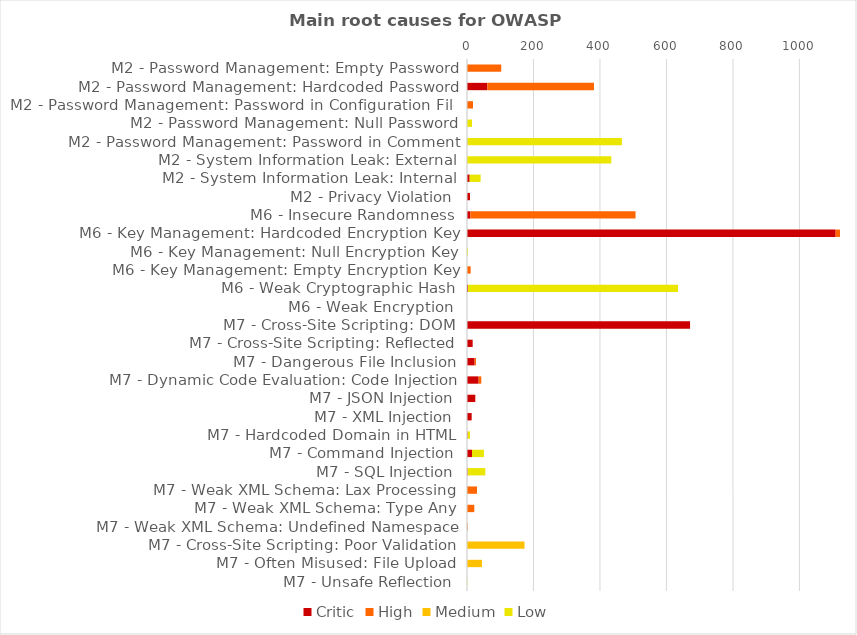
| Category | Critic | High | Medium | Low |
|---|---|---|---|---|
| M2 - Password Management: Empty Password | 0 | 103 | 0 | 0 |
| M2 - Password Management: Hardcoded Password | 61 | 321 | 0 | 0 |
| M2 - Password Management: Password in Configuration File | 0 | 18 | 0 | 0 |
| M2 - Password Management: Null Password | 0 | 0 | 0 | 15 |
| M2 - Password Management: Password in Comment | 1 | 0 | 0 | 465 |
| M2 - System Information Leak: External | 0 | 0 | 0 | 434 |
| M2 - System Information Leak: Internal | 8 | 0 | 0 | 33 |
| M2 - Privacy Violation | 9 | 0 | 0 | 0 |
| M6 - Insecure Randomness | 10 | 497 | 0 | 0 |
| M6 - Key Management: Hardcoded Encryption Key | 1109 | 13 | 0 | 0 |
| M6 - Key Management: Null Encryption Key | 0 | 0 | 0 | 3 |
| M6 - Key Management: Empty Encryption Key | 0 | 11 | 0 | 0 |
| M6 - Weak Cryptographic Hash | 3 | 0 | 0 | 632 |
| M6 - Weak Encryption | 0 | 0 | 0 | 0 |
| M7 - Cross-Site Scripting: DOM | 671 | 0 | 0 | 0 |
| M7 - Cross-Site Scripting: Reflected | 17 | 0 | 0 | 0 |
| M7 - Dangerous File Inclusion | 23 | 4 | 0 | 0 |
| M7 - Dynamic Code Evaluation: Code Injection | 35 | 8 | 0 | 0 |
| M7 - JSON Injection | 25 | 0 | 0 | 0 |
| M7 - XML Injection | 14 | 0 | 0 | 0 |
| M7 - Hardcoded Domain in HTML | 2 | 0 | 0 | 7 |
| M7 - Command Injection | 15 | 0 | 0 | 36 |
| M7 - SQL Injection | 2 | 0 | 0 | 53 |
| M7 - Weak XML Schema: Lax Processing | 0 | 30 | 0 | 0 |
| M7 - Weak XML Schema: Type Any | 0 | 22 | 0 | 0 |
| M7 - Weak XML Schema: Undefined Namespace | 0 | 2 | 0 | 0 |
| M7 - Cross-Site Scripting: Poor Validation | 0 | 0 | 173 | 0 |
| M7 - Often Misused: File Upload | 0 | 0 | 45 | 0 |
| M7 - Unsafe Reflection | 0 | 0 | 0 | 1 |